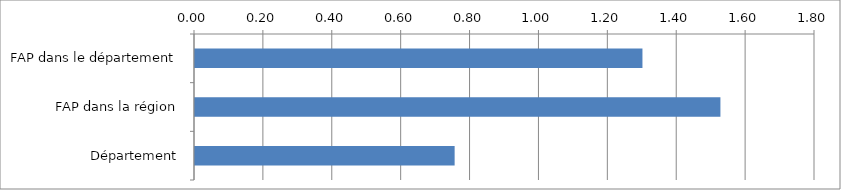
| Category | Tension |
|---|---|
| FAP dans le département | 1.299 |
| FAP dans la région | 1.525 |
| Département | 0.754 |